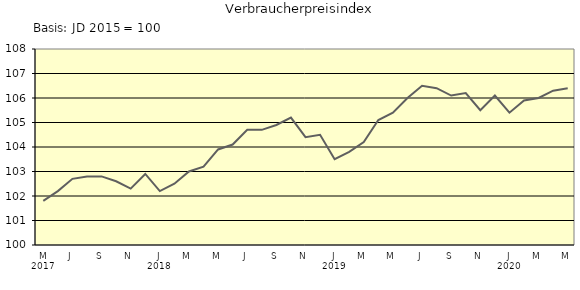
| Category | Series 0 |
|---|---|
| 0 | 101.8 |
| 1 | 102.2 |
| 2 | 102.7 |
| 3 | 102.8 |
| 4 | 102.8 |
| 5 | 102.6 |
| 6 | 102.3 |
| 7 | 102.9 |
| 8 | 102.2 |
| 9 | 102.5 |
| 10 | 103 |
| 11 | 103.2 |
| 12 | 103.9 |
| 13 | 104.1 |
| 14 | 104.7 |
| 15 | 104.7 |
| 16 | 104.9 |
| 17 | 105.2 |
| 18 | 104.4 |
| 19 | 104.5 |
| 20 | 103.5 |
| 21 | 103.8 |
| 22 | 104.2 |
| 23 | 105.1 |
| 24 | 105.4 |
| 25 | 106 |
| 26 | 106.5 |
| 27 | 106.4 |
| 28 | 106.1 |
| 29 | 106.2 |
| 30 | 105.5 |
| 31 | 106.1 |
| 32 | 105.4 |
| 33 | 105.9 |
| 34 | 106 |
| 35 | 106.3 |
| 36 | 106.4 |